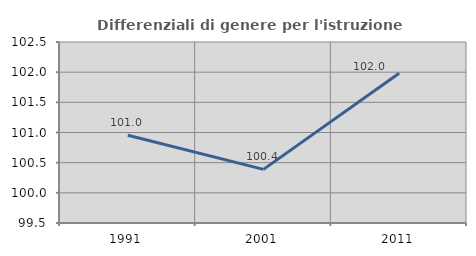
| Category | Differenziali di genere per l'istruzione superiore |
|---|---|
| 1991.0 | 100.953 |
| 2001.0 | 100.388 |
| 2011.0 | 101.982 |